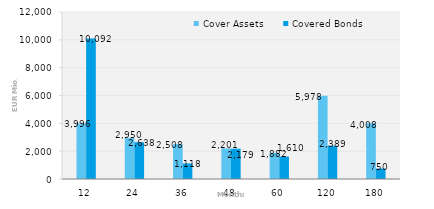
| Category | Cover Assets | Covered Bonds |
|---|---|---|
| 12.0 | 3995.789 | 10092 |
| 24.0 | 2950.347 | 2638 |
| 36.0 | 2507.722 | 1118 |
| 48.0 | 2201.256 | 2179 |
| 60.0 | 1881.872 | 1610 |
| 120.0 | 5978.068 | 2388.5 |
| 180.0 | 4008.343 | 750 |